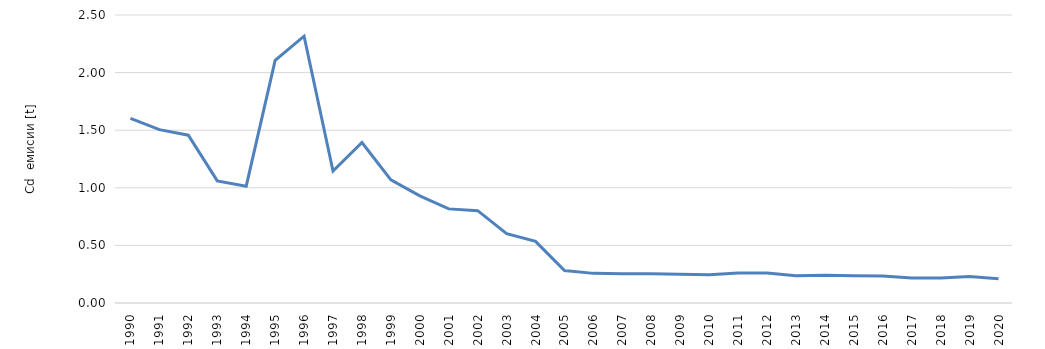
| Category | Series 0 |
|---|---|
| 1990.0 | 1.602 |
| 1991.0 | 1.505 |
| 1992.0 | 1.456 |
| 1993.0 | 1.06 |
| 1994.0 | 1.014 |
| 1995.0 | 2.106 |
| 1996.0 | 2.316 |
| 1997.0 | 1.145 |
| 1998.0 | 1.393 |
| 1999.0 | 1.069 |
| 2000.0 | 0.93 |
| 2001.0 | 0.817 |
| 2002.0 | 0.802 |
| 2003.0 | 0.602 |
| 2004.0 | 0.535 |
| 2005.0 | 0.282 |
| 2006.0 | 0.257 |
| 2007.0 | 0.255 |
| 2008.0 | 0.253 |
| 2009.0 | 0.249 |
| 2010.0 | 0.244 |
| 2011.0 | 0.26 |
| 2012.0 | 0.26 |
| 2013.0 | 0.237 |
| 2014.0 | 0.24 |
| 2015.0 | 0.236 |
| 2016.0 | 0.234 |
| 2017.0 | 0.217 |
| 2018.0 | 0.217 |
| 2019.0 | 0.23 |
| 2020.0 | 0.211 |